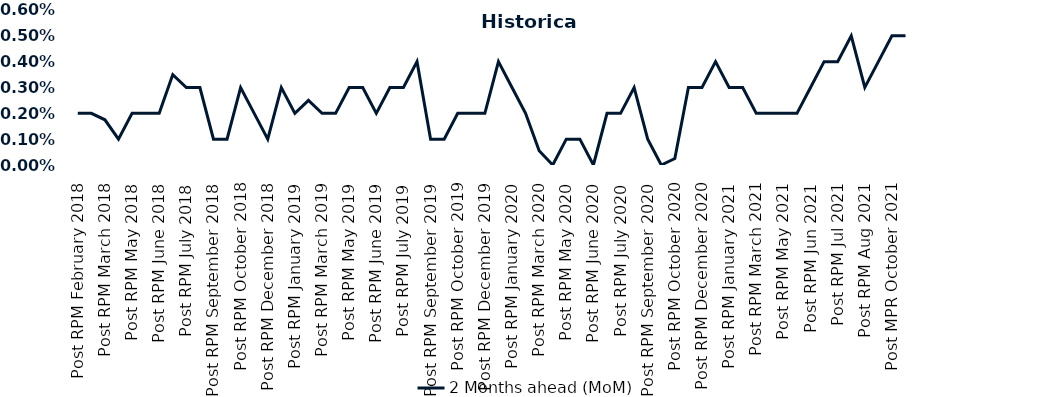
| Category | 2 Months ahead (MoM) |
|---|---|
| Post RPM February 2018 | 0.002 |
| Pre RPM March 2018 | 0.002 |
| Post RPM March 2018 | 0.002 |
| Pre RPM May 2018 | 0.001 |
| Post RPM May 2018 | 0.002 |
| Pre RPM June 2018 | 0.002 |
| Post RPM June 2018 | 0.002 |
| Pre RPM July 2018 | 0.004 |
| Post RPM July 2018 | 0.003 |
| Pre RPM September 2018 | 0.003 |
| Post RPM September 2018 | 0.001 |
| Pre RPM October 2018 | 0.001 |
| Post RPM October 2018 | 0.003 |
| Pre RPM December 2018 | 0.002 |
| Post RPM December 2018 | 0.001 |
| Pre RPM January 2019 | 0.003 |
| Post RPM January 2019 | 0.002 |
| Pre RPM March 2019 | 0.002 |
| Post RPM March 2019 | 0.002 |
| Pre RPM May 2019 | 0.002 |
| Post RPM May 2019 | 0.003 |
| Pre RPM June 2019 | 0.003 |
| Post RPM June 2019 | 0.002 |
| Pre RPM July 2019 | 0.003 |
| Post RPM July 2019 | 0.003 |
| Pre RPM September 2019 | 0.004 |
| Post RPM September 2019 | 0.001 |
| Pre RPM October 2019 | 0.001 |
| Post RPM October 2019 | 0.002 |
| Pre RPM December 2019 | 0.002 |
| Post RPM December 2019 | 0.002 |
| Pre RPM January 2020 | 0.004 |
| Post RPM January 2020 | 0.003 |
| Pre RPM March 2020 | 0.002 |
| Post RPM March 2020 | 0.001 |
| Pre RPM May 2020 | 0 |
| Post RPM May 2020 | 0.001 |
| Pre RPM June 2020 | 0.001 |
| Post RPM June 2020 | 0 |
| Pre RPM July 2020 | 0.002 |
| Post RPM July 2020 | 0.002 |
| Pre RPM September 2020 | 0.003 |
| Post RPM September 2020 | 0.001 |
| Pre RPM October 2020 | 0 |
| Post RPM October 2020 | 0 |
| Pre RPM December 2020 | 0.003 |
|  Post RPM December 2020 | 0.003 |
| Pre RPM January 2021 | 0.004 |
| Post RPM January 2021 | 0.003 |
|  Pre RPM March 2021 | 0.003 |
|  Post RPM March 2021 | 0.002 |
|  Pre RPM May 2021 | 0.002 |
|  Post RPM May 2021 | 0.002 |
|  Pre RPM Jun 2021 | 0.002 |
|   Post RPM Jun 2021 | 0.003 |
| Pre RPM Jul 2021 | 0.004 |
|  Post RPM Jul 2021 | 0.004 |
| Pre RPM Aug 2021 | 0.005 |
|  Post RPM Aug 2021 | 0.003 |
| Pre MPR October 2021 | 0.004 |
| Post MPR October 2021 | 0.005 |
| Pre MPR December 2021 | 0.005 |